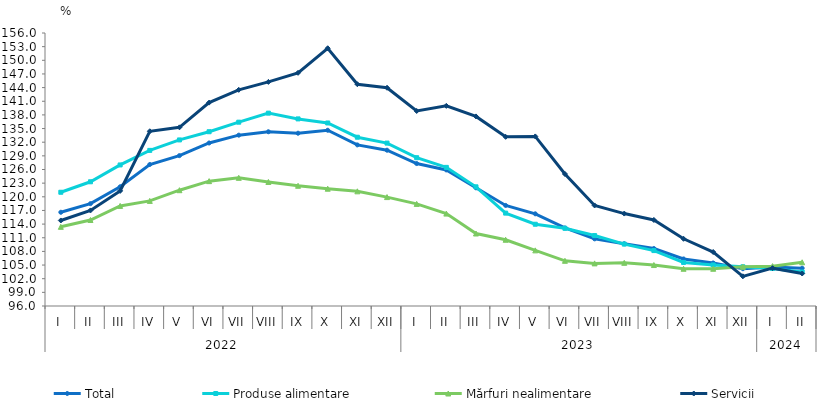
| Category | Total  | Produse alimentare | Mărfuri nealimentare  | Servicii |
|---|---|---|---|---|
| 0 | 116.6 | 121 | 113.4 | 114.8 |
| 1 | 118.5 | 123.3 | 114.9 | 117 |
| 2 | 122.2 | 127 | 118 | 121.3 |
| 3 | 127.1 | 130.2 | 119.1 | 134.4 |
| 4 | 129.047 | 132.5 | 121.45 | 135.267 |
| 5 | 131.827 | 134.301 | 123.443 | 140.701 |
| 6 | 133.547 | 136.399 | 124.168 | 143.511 |
| 7 | 134.294 | 138.387 | 123.256 | 145.253 |
| 8 | 133.971 | 137.121 | 122.424 | 147.248 |
| 9 | 134.625 | 136.226 | 121.779 | 152.646 |
| 10 | 131.406 | 133.093 | 121.201 | 144.742 |
| 11 | 130.241 | 131.801 | 119.936 | 143.965 |
| 12 | 127.307 | 128.59 | 118.441 | 138.865 |
| 13 | 125.91 | 126.47 | 116.31 | 139.99 |
| 14 | 121.977 | 122.19 | 111.932 | 137.666 |
| 15 | 118.102 | 116.414 | 110.554 | 133.178 |
| 16 | 116.262 | 113.97 | 108.228 | 133.268 |
| 17 | 113.152 | 113.076 | 105.931 | 125.017 |
| 18 | 110.755 | 111.48 | 105.365 | 118.101 |
| 19 | 109.689 | 109.605 | 105.486 | 116.313 |
| 20 | 108.634 | 108.179 | 105.004 | 114.916 |
| 21 | 106.342 | 105.575 | 104.182 | 110.77 |
| 22 | 105.453 | 105.022 | 104.182 | 107.863 |
| 23 | 104.199 | 104.62 | 104.612 | 102.522 |
| 24 | 104.552 | 104.242 | 104.76 | 104.317 |
| 25 | 104.308 | 103.467 | 105.607 | 103.141 |